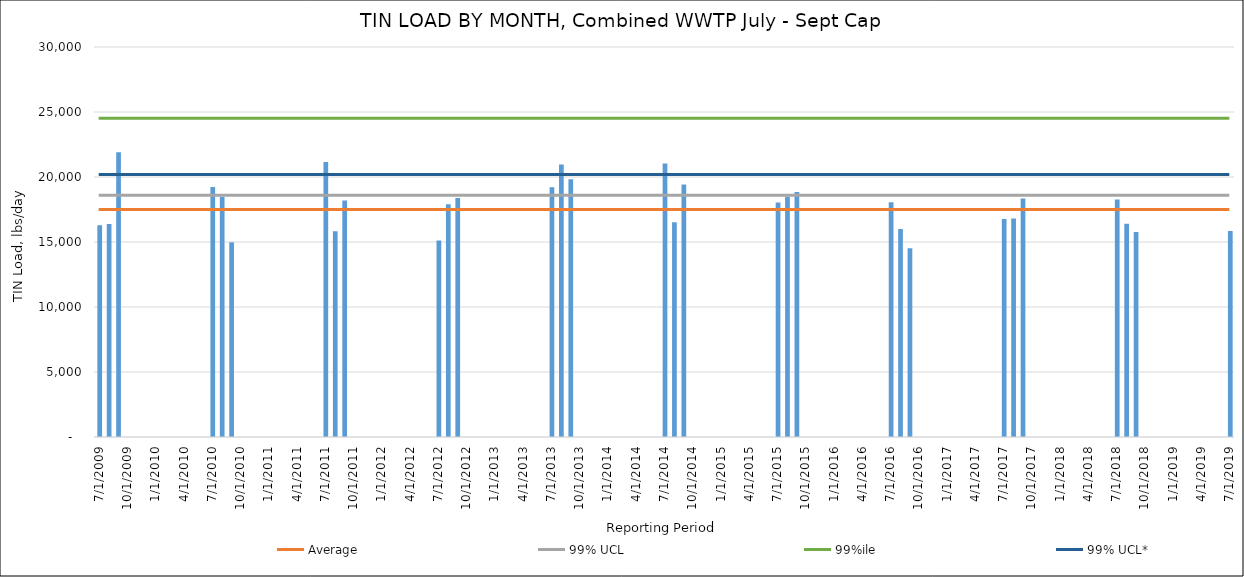
| Category | Series 0 |
|---|---|
| 7/31/09 | 16287.214 |
| 8/31/09 | 16393.016 |
| 9/30/09 | 21900.907 |
| 7/31/10 | 19228.082 |
| 8/31/10 | 18489.96 |
| 9/30/10 | 14984.572 |
| 7/31/11 | 21158.193 |
| 8/31/11 | 15831.48 |
| 9/30/11 | 18200.295 |
| 7/31/12 | 15107.676 |
| 8/31/12 | 17910.344 |
| 9/30/12 | 18385.659 |
| 7/31/13 | 19212.077 |
| 8/31/13 | 20956.694 |
| 9/30/13 | 19825.238 |
| 7/31/14 | 21045.485 |
| 8/31/14 | 16520.206 |
| 9/30/14 | 19417.317 |
| 7/31/15 | 18034.551 |
| 8/31/15 | 18473.705 |
| 9/30/15 | 18838.699 |
| 7/31/16 | 18062.797 |
| 8/31/16 | 15996.389 |
| 9/30/16 | 14519.646 |
| 7/31/17 | 16770.16 |
| 8/31/17 | 16808.381 |
| 9/30/17 | 18339.11 |
| 7/31/18 | 18274.977 |
| 8/31/18 | 16411.139 |
| 9/30/18 | 15759.663 |
| 7/31/19 | 15852.869 |